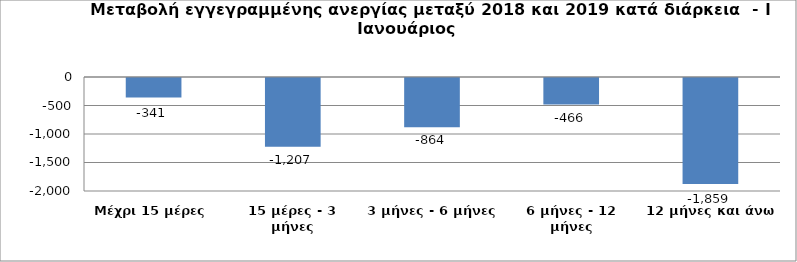
| Category | Series 0 |
|---|---|
| Μέχρι 15 μέρες | -341 |
| 15 μέρες - 3 μήνες | -1207 |
| 3 μήνες - 6 μήνες | -864 |
| 6 μήνες - 12 μήνες | -466 |
| 12 μήνες και άνω | -1859 |